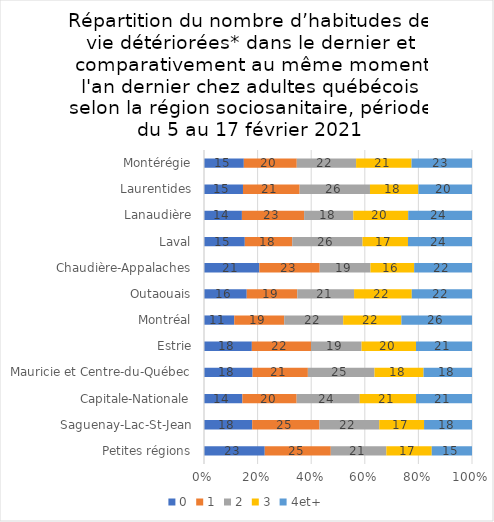
| Category | 0 | 1 | 2 | 3 | 4et+ |
|---|---|---|---|---|---|
| Petites régions | 22.667 | 24.649 | 20.723 | 16.937 | 15.024 |
| Saguenay-Lac-St-Jean | 17.986 | 25.108 | 22.279 | 16.738 | 17.889 |
| Capitale-Nationale | 14.323 | 20.252 | 23.538 | 21.006 | 20.881 |
| Mauricie et Centre-du-Québec | 18.134 | 20.626 | 24.857 | 18.307 | 18.076 |
| Estrie | 17.855 | 22.074 | 18.859 | 20.321 | 20.89 |
| Montréal | 11.286 | 18.643 | 22.004 | 21.716 | 26.351 |
| Outaouais | 15.948 | 18.861 | 21.184 | 21.532 | 22.475 |
| Chaudière-Appalaches | 20.648 | 22.529 | 18.948 | 16.301 | 21.575 |
| Laval | 15.227 | 17.694 | 26.218 | 16.97 | 23.891 |
| Lanaudière | 14.149 | 23.207 | 18.341 | 20.496 | 23.806 |
| Laurentides | 14.545 | 21.143 | 26.242 | 18.073 | 19.997 |
| Montérégie | 14.859 | 19.762 | 22.133 | 20.686 | 22.56 |